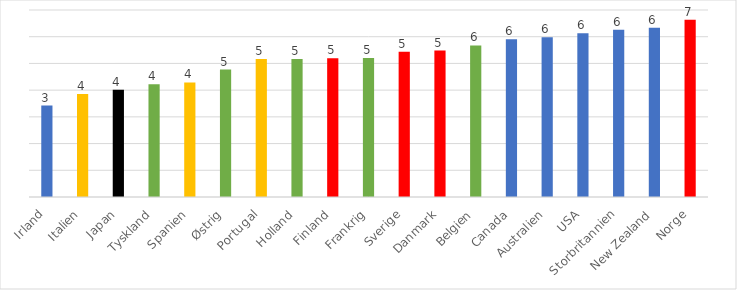
| Category | Series 0 |
|---|---|
| Irland | 3.421 |
| Italien | 3.851 |
| Japan | 4.013 |
| Tyskland | 4.221 |
| Spanien | 4.286 |
| Østrig | 4.772 |
| Portugal | 5.165 |
| Holland | 5.167 |
| Finland | 5.194 |
| Frankrig | 5.2 |
| Sverige | 5.436 |
| Danmark | 5.48 |
| Belgien | 5.673 |
| Canada | 5.901 |
| Australien | 5.978 |
| USA | 6.134 |
| Storbritannien | 6.263 |
| New Zealand | 6.333 |
| Norge | 6.633 |